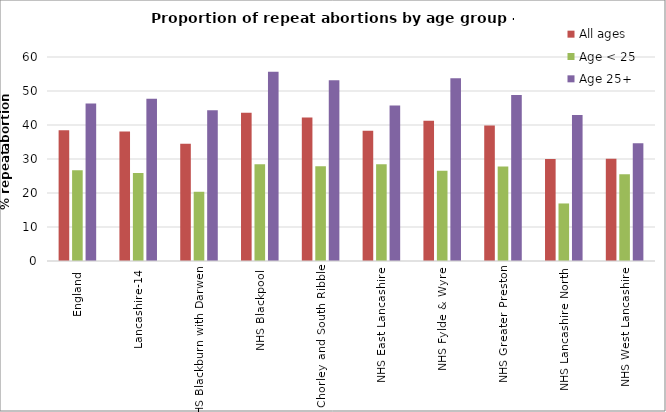
| Category | All ages | Age < 25 | Age 25+ |
|---|---|---|---|
| England | 38.442 | 26.668 | 46.319 |
| Lancashire-14 | 38.081 | 25.895 | 47.688 |
| NHS Blackburn with Darwen | 34.451 | 20.362 | 44.304 |
| NHS Blackpool | 43.611 | 28.44 | 55.636 |
| NHS Chorley and South Ribble | 42.171 | 27.885 | 53.137 |
| NHS East Lancashire | 38.342 | 28.442 | 45.737 |
| NHS Fylde & Wyre | 41.266 | 26.519 | 53.738 |
| NHS Greater Preston | 39.882 | 27.778 | 48.843 |
| NHS Lancashire North | 30.025 | 16.923 | 42.929 |
| NHS West Lancashire | 30.1 | 25.503 | 34.667 |